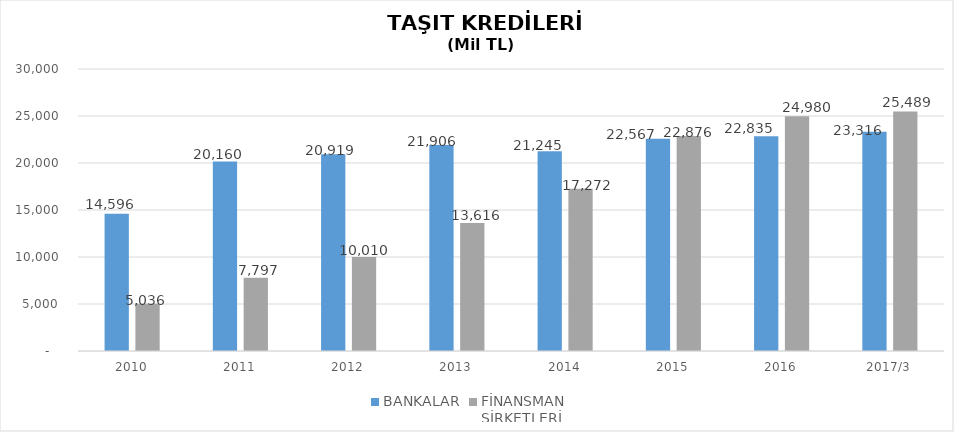
| Category | BANKALAR | FİNANSMAN 
ŞİRKETLERİ |
|---|---|---|
| 2010 | 14596 | 5035.89 |
| 2011 | 20160 | 7796.854 |
| 2012 | 20919 | 10009.755 |
| 2013 | 21906 | 13616.036 |
| 2014 | 21245 | 17271.844 |
| 2015 | 22567 | 22875.563 |
| 2016 | 22835 | 24980.231 |
| 2017/3 | 23316 | 25488.687 |